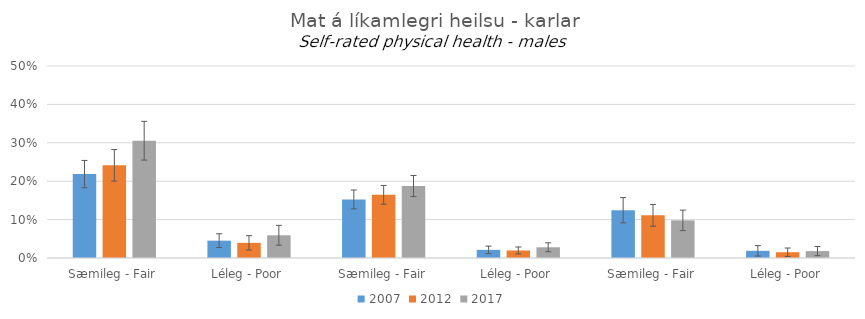
| Category | 2007 | 2012 | 2017 |
|---|---|---|---|
| 0 | 0.218 | 0.241 | 0.305 |
| 1 | 0.045 | 0.039 | 0.059 |
| 2 | 0.153 | 0.165 | 0.187 |
| 3 | 0.021 | 0.02 | 0.028 |
| 4 | 0.124 | 0.111 | 0.098 |
| 5 | 0.019 | 0.015 | 0.018 |